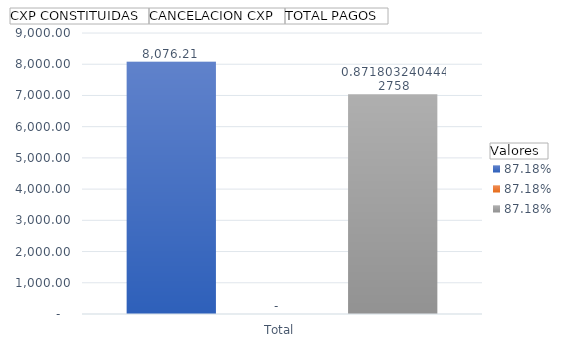
| Category | CXP CONSTITUIDAS | CANCELACION CXP | TOTAL PAGOS |
|---|---|---|---|
| Total | 8076.214 | 0 | 7040.869 |